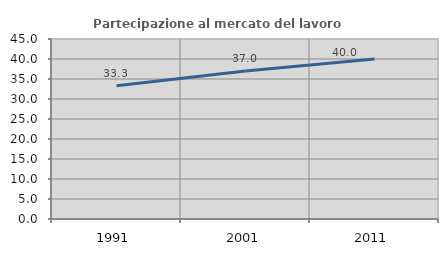
| Category | Partecipazione al mercato del lavoro  femminile |
|---|---|
| 1991.0 | 33.333 |
| 2001.0 | 37.019 |
| 2011.0 | 40 |